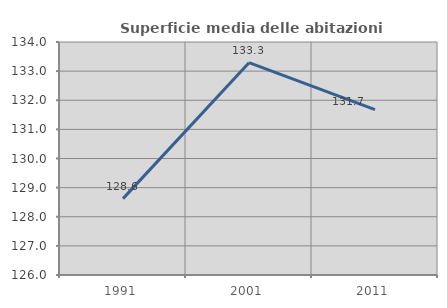
| Category | Superficie media delle abitazioni occupate |
|---|---|
| 1991.0 | 128.622 |
| 2001.0 | 133.291 |
| 2011.0 | 131.676 |